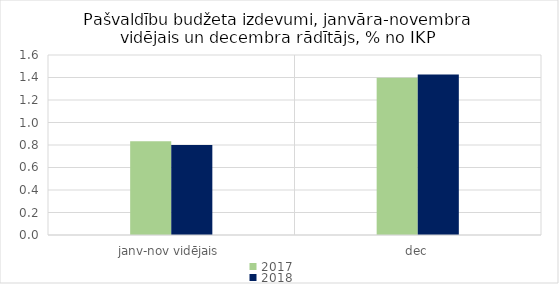
| Category | 2017 | 2018 |
|---|---|---|
| janv-nov vidējais | 0.834 | 0.799 |
| dec | 1.398 | 1.427 |